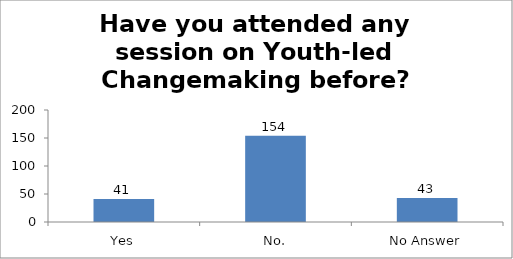
| Category | Have you attended any session on Youth-led Changemaking before? |
|---|---|
| Yes | 41 |
| No. | 154 |
| No Answer | 43 |